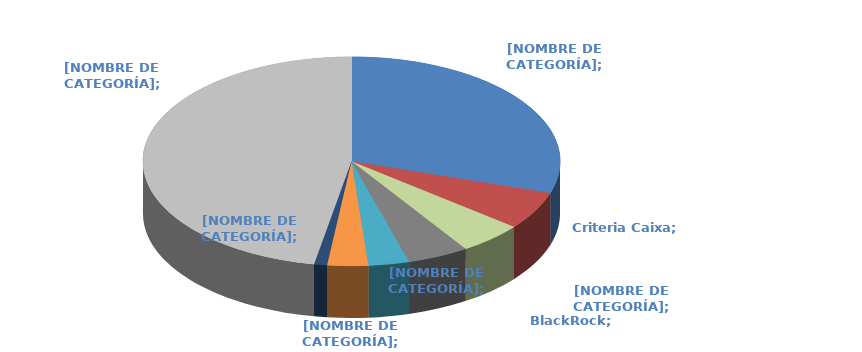
| Category | Series 0 |
|---|---|
| ConnecT S.p.A. | 0.299 |
| CRITERIA CAIXA, S.A.U. | 0.059 |
| Threadneedle | 0.05 |
| BLACKROCK INC. | 0.047 |
| Permian | 0.032 |
| Canda Pension Plan | 0.032 |
| 40 North | 0.01 |
| Free Float | 0.471 |